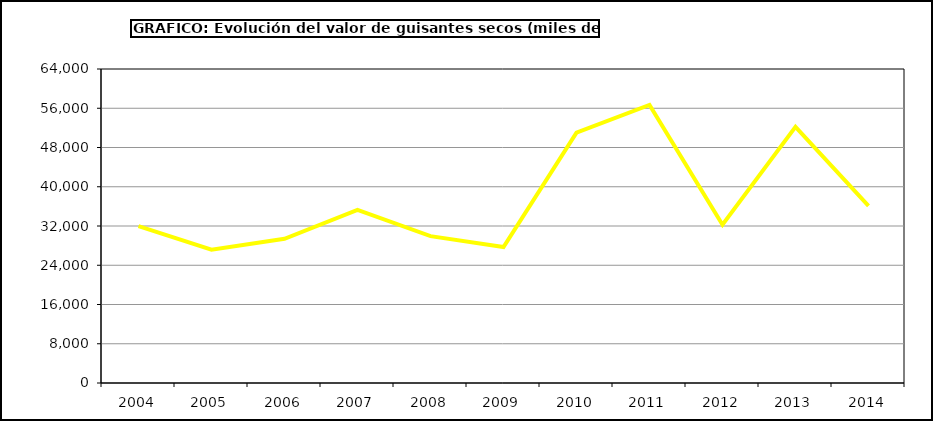
| Category | Valor |
|---|---|
| 2004.0 | 31971.633 |
| 2005.0 | 27163.868 |
| 2006.0 | 29383.981 |
| 2007.0 | 35293.602 |
| 2008.0 | 29934.579 |
| 2009.0 | 27725.625 |
| 2010.0 | 51044.567 |
| 2011.0 | 56666.277 |
| 2012.0 | 32251.03 |
| 2013.0 | 52203.832 |
| 2014.0 | 36116.283 |